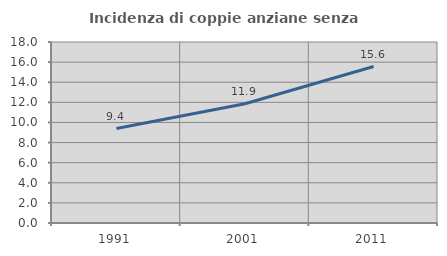
| Category | Incidenza di coppie anziane senza figli  |
|---|---|
| 1991.0 | 9.391 |
| 2001.0 | 11.855 |
| 2011.0 | 15.559 |